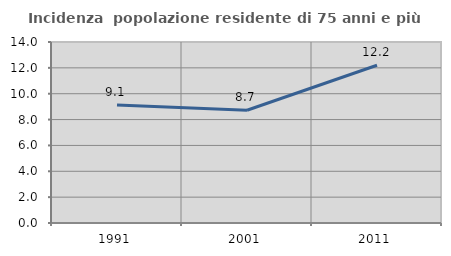
| Category | Incidenza  popolazione residente di 75 anni e più |
|---|---|
| 1991.0 | 9.13 |
| 2001.0 | 8.722 |
| 2011.0 | 12.2 |